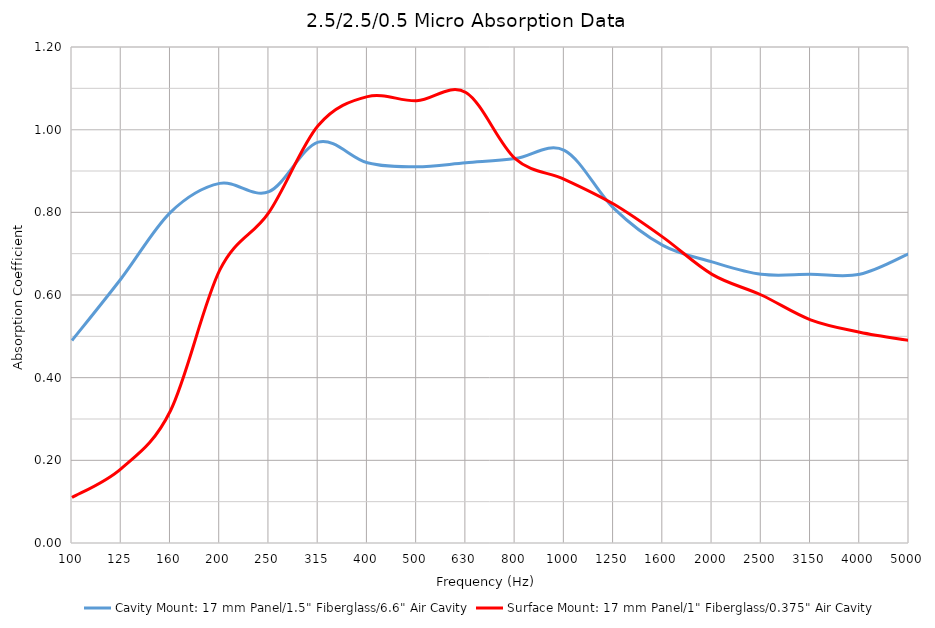
| Category | Cavity Mount: 17 mm Panel/1.5" Fiberglass/6.6" Air Cavity | Surface Mount: 17 mm Panel/1" Fiberglass/0.375" Air Cavity |
|---|---|---|
| 100.0 | 0.49 | 0.11 |
| 125.0 | 0.64 | 0.18 |
| 160.0 | 0.8 | 0.32 |
| 200.0 | 0.87 | 0.66 |
| 250.0 | 0.85 | 0.8 |
| 315.0 | 0.97 | 1.01 |
| 400.0 | 0.92 | 1.08 |
| 500.0 | 0.91 | 1.07 |
| 630.0 | 0.92 | 1.09 |
| 800.0 | 0.93 | 0.93 |
| 1000.0 | 0.95 | 0.88 |
| 1250.0 | 0.81 | 0.82 |
| 1600.0 | 0.72 | 0.74 |
| 2000.0 | 0.68 | 0.65 |
| 2500.0 | 0.65 | 0.6 |
| 3150.0 | 0.65 | 0.54 |
| 4000.0 | 0.65 | 0.51 |
| 5000.0 | 0.7 | 0.49 |